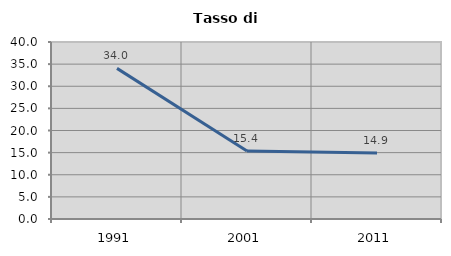
| Category | Tasso di disoccupazione   |
|---|---|
| 1991.0 | 34.043 |
| 2001.0 | 15.385 |
| 2011.0 | 14.943 |